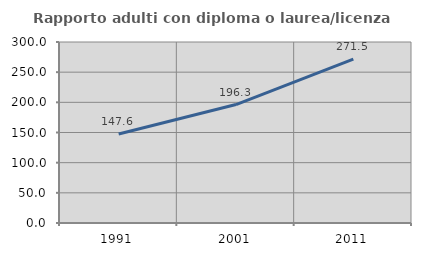
| Category | Rapporto adulti con diploma o laurea/licenza media  |
|---|---|
| 1991.0 | 147.597 |
| 2001.0 | 196.35 |
| 2011.0 | 271.467 |